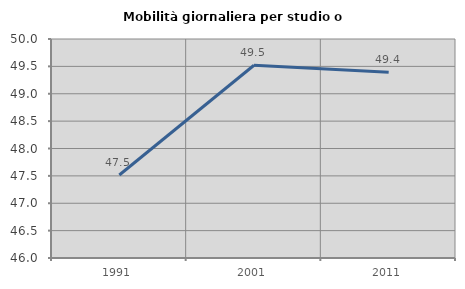
| Category | Mobilità giornaliera per studio o lavoro |
|---|---|
| 1991.0 | 47.516 |
| 2001.0 | 49.521 |
| 2011.0 | 49.394 |